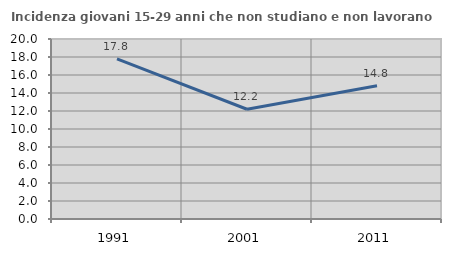
| Category | Incidenza giovani 15-29 anni che non studiano e non lavorano  |
|---|---|
| 1991.0 | 17.782 |
| 2001.0 | 12.195 |
| 2011.0 | 14.815 |